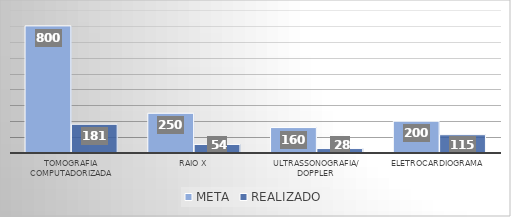
| Category | META | REALIZADO |
|---|---|---|
| Tomografia computadorizada | 800 | 181 |
| Raio x | 250 | 54 |
| Ultrassonografia/ Doppler  | 160 | 28 |
| Eletrocardiograma | 200 | 115 |